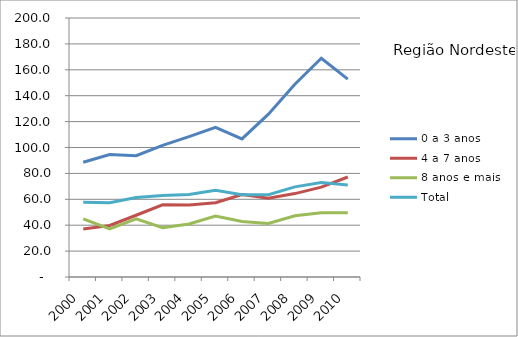
| Category | 0 a 3 anos | 4 a 7 anos | 8 anos e mais | Total |
|---|---|---|---|---|
| 2000.0 | 88.6 | 37.1 | 44.9 | 57.7 |
| 2001.0 | 94.6 | 39.8 | 37.1 | 57.4 |
| 2002.0 | 93.7 | 47.7 | 44.9 | 61.4 |
| 2003.0 | 101.7 | 55.7 | 38 | 63 |
| 2004.0 | 108.4 | 55.6 | 40.9 | 63.7 |
| 2005.0 | 115.6 | 57.4 | 47.1 | 67 |
| 2006.0 | 106.6 | 63.6 | 42.8 | 63.6 |
| 2007.0 | 125.7 | 60.8 | 41.4 | 63.6 |
| 2008.0 | 148.8 | 64.4 | 47.3 | 69.6 |
| 2009.0 | 168.9 | 69.4 | 49.7 | 72.9 |
| 2010.0 | 152.8 | 77.2 | 49.7 | 71.1 |